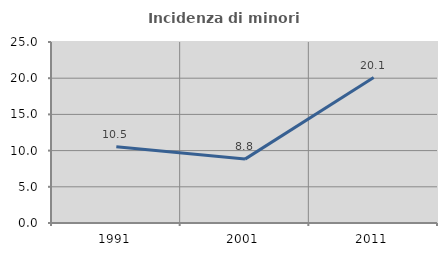
| Category | Incidenza di minori stranieri |
|---|---|
| 1991.0 | 10.526 |
| 2001.0 | 8.824 |
| 2011.0 | 20.091 |